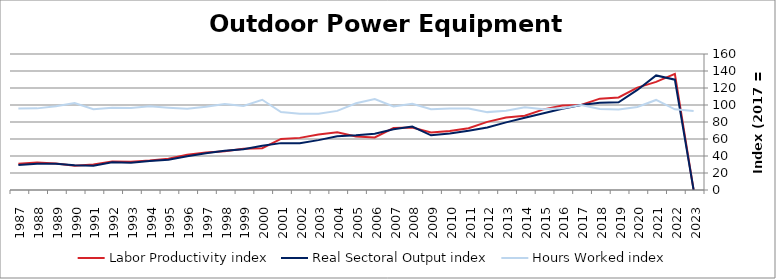
| Category | Labor Productivity index | Real Sectoral Output index | Hours Worked index |
|---|---|---|---|
| 2023.0 | 0 | 0 | 92.986 |
| 2022.0 | 136.668 | 129.796 | 94.971 |
| 2021.0 | 127.214 | 134.78 | 105.947 |
| 2020.0 | 120.475 | 117.699 | 97.696 |
| 2019.0 | 108.824 | 103.091 | 94.732 |
| 2018.0 | 107.477 | 102.528 | 95.395 |
| 2017.0 | 100 | 100 | 100 |
| 2016.0 | 99.327 | 95.486 | 96.133 |
| 2015.0 | 94.882 | 90.223 | 95.089 |
| 2014.0 | 87.356 | 85.016 | 97.322 |
| 2013.0 | 85.366 | 79.571 | 93.212 |
| 2012.0 | 80.187 | 73.47 | 91.623 |
| 2011.0 | 72.74 | 69.712 | 95.837 |
| 2010.0 | 69.295 | 66.515 | 95.988 |
| 2009.0 | 67.748 | 64.364 | 95.004 |
| 2008.0 | 73.462 | 74.59 | 101.536 |
| 2007.0 | 72.809 | 71.496 | 98.197 |
| 2006.0 | 61.878 | 66.191 | 106.969 |
| 2005.0 | 63.076 | 64.33 | 101.987 |
| 2004.0 | 67.981 | 63.267 | 93.066 |
| 2003.0 | 65.343 | 58.663 | 89.778 |
| 2002.0 | 61.325 | 55.041 | 89.752 |
| 2001.0 | 60.087 | 55.146 | 91.776 |
| 2000.0 | 49.099 | 52.124 | 106.161 |
| 1999.0 | 48.573 | 47.963 | 98.745 |
| 1998.0 | 45.569 | 46.122 | 101.212 |
| 1997.0 | 44.045 | 43.159 | 97.989 |
| 1996.0 | 41.417 | 39.592 | 95.595 |
| 1995.0 | 36.862 | 35.707 | 96.867 |
| 1994.0 | 34.727 | 34.243 | 98.608 |
| 1993.0 | 33.232 | 32.043 | 96.423 |
| 1992.0 | 33.62 | 32.566 | 96.866 |
| 1991.0 | 30.03 | 28.544 | 95.052 |
| 1990.0 | 28.534 | 29.179 | 102.262 |
| 1989.0 | 31.299 | 30.802 | 98.41 |
| 1988.0 | 32.236 | 30.957 | 96.033 |
| 1987.0 | 30.83 | 29.521 | 95.757 |